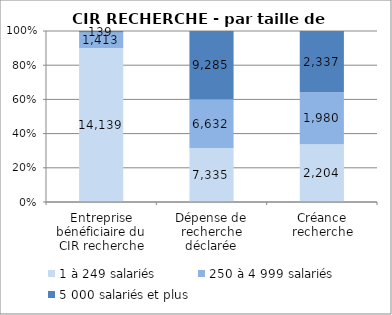
| Category | 1 à 249 salariés | 250 à 4 999 salariés | 5 000 salariés et plus |
|---|---|---|---|
| Entreprise bénéficiaire du CIR recherche | 14139 | 1413 | 139 |
| Dépense de recherche déclarée | 7334.7 | 6632.3 | 9285.33 |
| Créance recherche | 2204.28 | 1979.75 | 2337.44 |